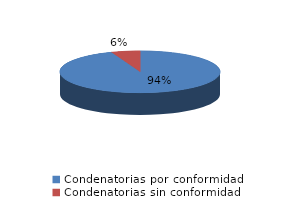
| Category | Series 0 |
|---|---|
| 0 | 781 |
| 1 | 48 |